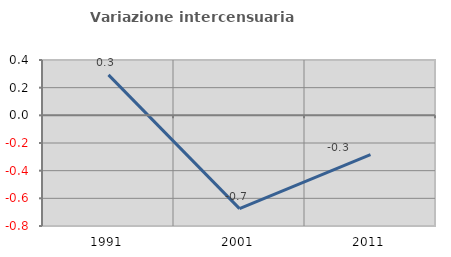
| Category | Variazione intercensuaria annua |
|---|---|
| 1991.0 | 0.293 |
| 2001.0 | -0.675 |
| 2011.0 | -0.284 |